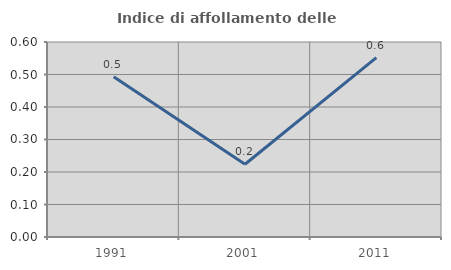
| Category | Indice di affollamento delle abitazioni  |
|---|---|
| 1991.0 | 0.493 |
| 2001.0 | 0.224 |
| 2011.0 | 0.552 |